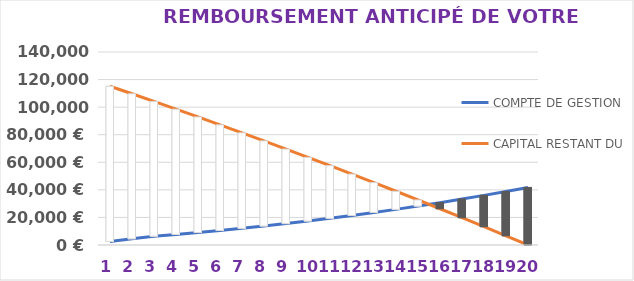
| Category | COMPTE DE GESTION | CAPITAL RESTANT DU |
|---|---|---|
| 0 | 2593.689 | 115170.007 |
| 1 | 4484.977 | 109689.47 |
| 2 | 6373.842 | 104148.343 |
| 3 | 7662.259 | 98545.955 |
| 4 | 9043.491 | 92881.629 |
| 5 | 10518.714 | 87154.68 |
| 6 | 12089.118 | 81364.416 |
| 7 | 13755.911 | 75510.137 |
| 8 | 15520.311 | 69591.135 |
| 9 | 17383.557 | 63606.696 |
| 10 | 19346.899 | 57556.094 |
| 11 | 21411.606 | 51438.599 |
| 12 | 23578.961 | 45253.472 |
| 13 | 25850.266 | 38999.964 |
| 14 | 28226.836 | 32677.319 |
| 15 | 30710.004 | 26284.774 |
| 16 | 33301.121 | 19821.555 |
| 17 | 36001.554 | 13286.881 |
| 18 | 38812.687 | 6679.962 |
| 19 | 41735.923 | 0 |